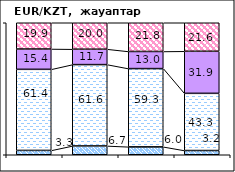
| Category | позитивно | не повлияло | негативно | не знаю |
|---|---|---|---|---|
| 0 | 3.29 | 61.43 | 15.4 | 19.88 |
| 1 | 6.68 | 61.61 | 11.67 | 20.04 |
| 2 | 5.98 | 59.29 | 12.97 | 21.76 |
| 3 | 3.2 | 43.33 | 31.86 | 21.61 |